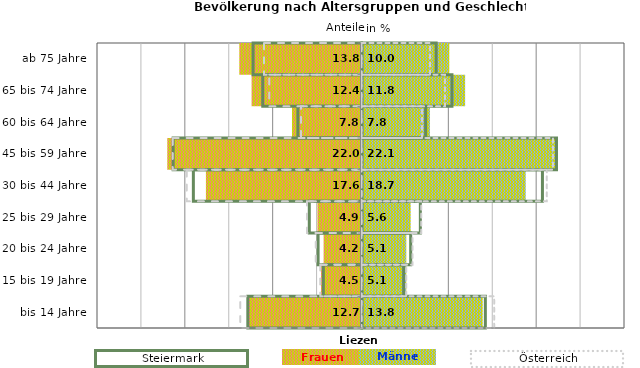
| Category | Frauen | Männer | Frauen Spalte2 | Männer Spalte2 | Frauen Spalte3 | Männer Spalte3 |
|---|---|---|---|---|---|---|
| bis 14 Jahre | -12.7 | 13.8 | 14.1 | -13 | -13.8 | 15.1 |
| 15 bis 19 Jahre | -4.5 | 5.1 | 4.8 | -4.4 | -4.7 | 5.1 |
| 20 bis 24 Jahre | -4.2 | 5.1 | 5.6 | -5 | -5.2 | 5.8 |
| 25 bis 29 Jahre | -4.9 | 5.6 | 6.7 | -6 | -6.2 | 6.8 |
| 30 bis 44 Jahre | -17.6 | 18.7 | 20.6 | -19.2 | -19.9 | 21.1 |
| 45 bis 59 Jahre | -22 | 22.1 | 22.2 | -21.5 | -21.5 | 21.8 |
| 60 bis 64 Jahre | -7.8 | 7.8 | 7.3 | -7.3 | -6.9 | 6.9 |
| 65 bis 74 Jahre | -12.4 | 11.8 | 10.3 | -11.3 | -10.5 | 9.5 |
| ab 75 Jahre | -13.8 | 10 | 8.5 | -12.4 | -11.1 | 7.8 |